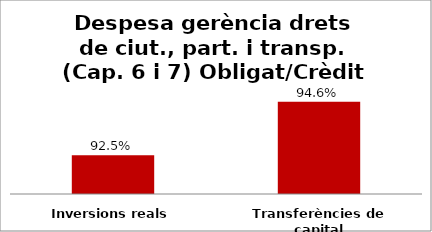
| Category | Series 0 |
|---|---|
| Inversions reals | 0.925 |
| Transferències de capital | 0.946 |